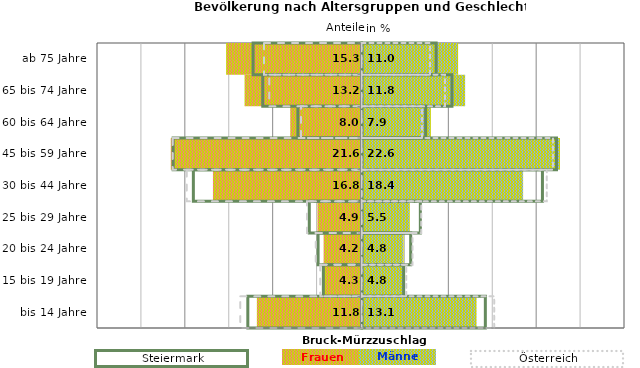
| Category | Frauen | Männer | Frauen Spalte2 | Männer Spalte2 | Frauen Spalte3 | Männer Spalte3 |
|---|---|---|---|---|---|---|
| bis 14 Jahre | -11.8 | 13.1 | 14.1 | -13 | -13.8 | 15.1 |
| 15 bis 19 Jahre | -4.3 | 4.8 | 4.8 | -4.4 | -4.7 | 5.1 |
| 20 bis 24 Jahre | -4.2 | 4.8 | 5.6 | -5 | -5.2 | 5.8 |
| 25 bis 29 Jahre | -4.9 | 5.5 | 6.7 | -6 | -6.2 | 6.8 |
| 30 bis 44 Jahre | -16.8 | 18.4 | 20.6 | -19.2 | -19.9 | 21.1 |
| 45 bis 59 Jahre | -21.6 | 22.6 | 22.2 | -21.5 | -21.5 | 21.8 |
| 60 bis 64 Jahre | -8 | 7.9 | 7.3 | -7.3 | -6.9 | 6.9 |
| 65 bis 74 Jahre | -13.2 | 11.8 | 10.3 | -11.3 | -10.5 | 9.5 |
| ab 75 Jahre | -15.3 | 11 | 8.5 | -12.4 | -11.1 | 7.8 |